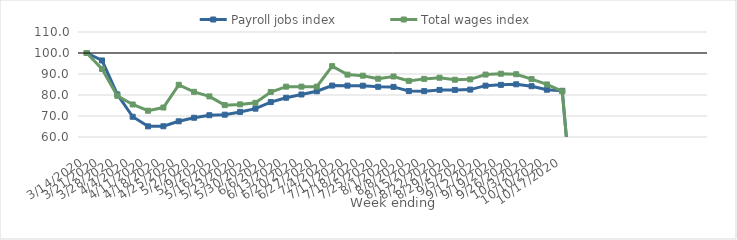
| Category | Payroll jobs index | Total wages index |
|---|---|---|
| 14/03/2020 | 100 | 100 |
| 21/03/2020 | 96.447 | 92.431 |
| 28/03/2020 | 80.264 | 79.627 |
| 04/04/2020 | 69.635 | 75.488 |
| 11/04/2020 | 65.068 | 72.515 |
| 18/04/2020 | 65.116 | 74.033 |
| 25/04/2020 | 67.484 | 84.863 |
| 02/05/2020 | 69.162 | 81.511 |
| 09/05/2020 | 70.377 | 79.34 |
| 16/05/2020 | 70.624 | 75.168 |
| 23/05/2020 | 71.946 | 75.53 |
| 30/05/2020 | 73.497 | 76.272 |
| 06/06/2020 | 76.613 | 81.436 |
| 13/06/2020 | 78.696 | 83.978 |
| 20/06/2020 | 80.241 | 83.978 |
| 27/06/2020 | 81.771 | 83.977 |
| 04/07/2020 | 84.487 | 93.733 |
| 11/07/2020 | 84.462 | 89.707 |
| 18/07/2020 | 84.428 | 89.2 |
| 25/07/2020 | 83.917 | 87.745 |
| 01/08/2020 | 83.863 | 88.815 |
| 08/08/2020 | 81.885 | 86.722 |
| 15/08/2020 | 81.834 | 87.673 |
| 22/08/2020 | 82.43 | 88.226 |
| 29/08/2020 | 82.415 | 87.273 |
| 05/09/2020 | 82.563 | 87.445 |
| 12/09/2020 | 84.446 | 89.726 |
| 19/09/2020 | 84.833 | 90.125 |
| 26/09/2020 | 85.093 | 89.882 |
| 03/10/2020 | 84.192 | 87.563 |
| 10/10/2020 | 82.515 | 85.036 |
| 17/10/2020 | 82.006 | 81.742 |